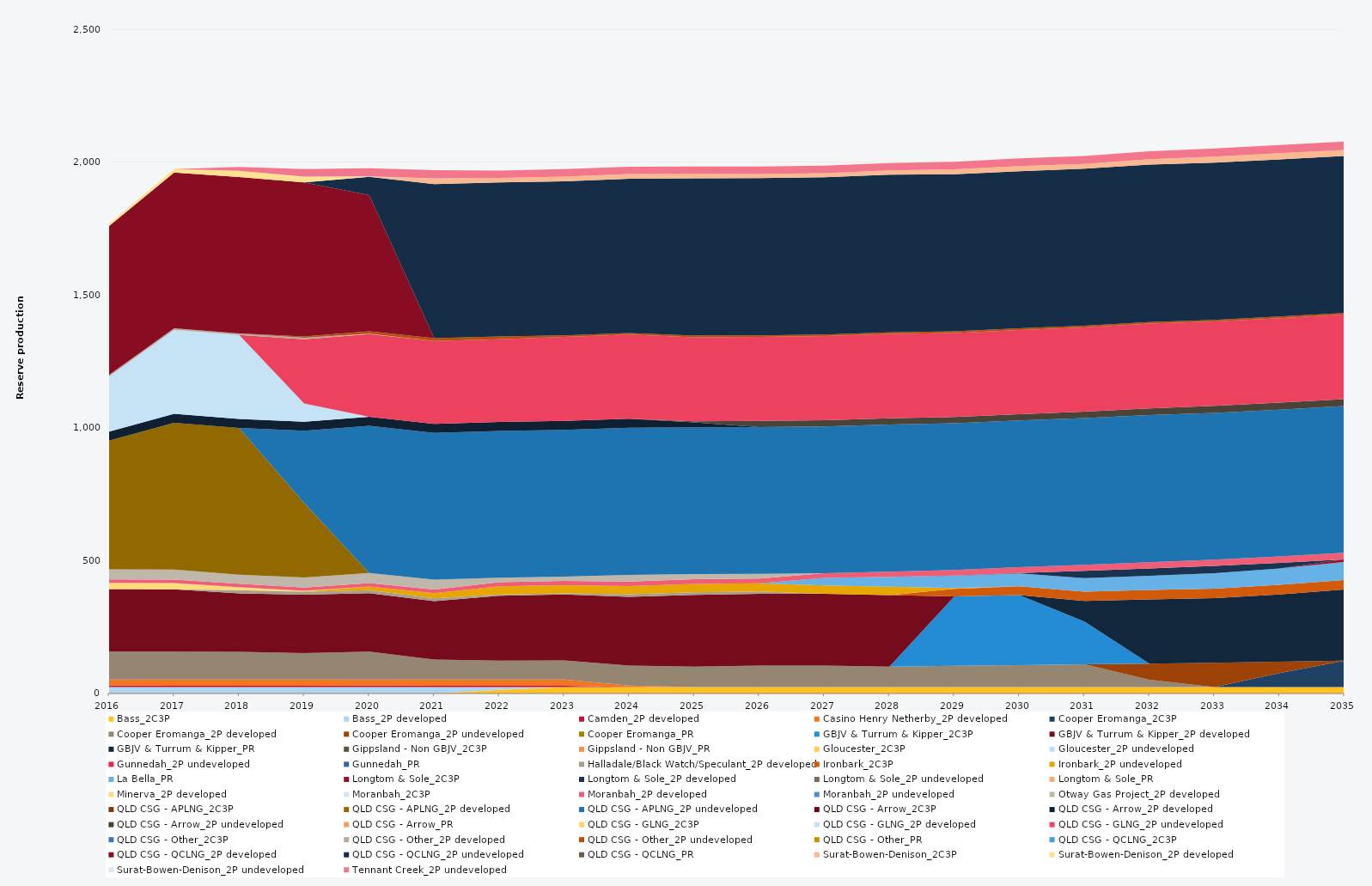
| Category | Bass_2C3P | Bass_2P developed | Camden_2P developed | Casino Henry Netherby_2P developed | Cooper Eromanga_2C3P | Cooper Eromanga_2P developed | Cooper Eromanga_2P undeveloped | Cooper Eromanga_PR | GBJV & Turrum & Kipper_2C3P | GBJV & Turrum & Kipper_2P developed | GBJV & Turrum & Kipper_PR | Gippsland - Non GBJV_2C3P | Gippsland - Non GBJV_PR | Gloucester_2C3P | Gloucester_2P undeveloped | Gunnedah_2P undeveloped | Gunnedah_PR | Halladale/Black Watch/Speculant_2P developed | Ironbark_2C3P | Ironbark_2P undeveloped | La Bella_PR | Longtom & Sole_2C3P | Longtom & Sole_2P developed | Longtom & Sole_2P undeveloped | Longtom & Sole_PR | Minerva_2P developed | Moranbah_2C3P | Moranbah_2P developed | Moranbah_2P undeveloped | Otway Gas Project_2P developed | QLD CSG - APLNG_2C3P | QLD CSG - APLNG_2P developed | QLD CSG - APLNG_2P undeveloped | QLD CSG - Arrow_2C3P | QLD CSG - Arrow_2P developed | QLD CSG - Arrow_2P undeveloped | QLD CSG - Arrow_PR | QLD CSG - GLNG_2C3P | QLD CSG - GLNG_2P developed | QLD CSG - GLNG_2P undeveloped | QLD CSG - Other_2C3P | QLD CSG - Other_2P developed | QLD CSG - Other_2P undeveloped | QLD CSG - Other_PR | QLD CSG - QCLNG_2C3P | QLD CSG - QCLNG_2P developed | QLD CSG - QCLNG_2P undeveloped | QLD CSG - QCLNG_PR | Surat-Bowen-Denison_2C3P | Surat-Bowen-Denison_2P developed | Surat-Bowen-Denison_2P undeveloped | Tennant Creek_2P undeveloped |
|---|---|---|---|---|---|---|---|---|---|---|---|---|---|---|---|---|---|---|---|---|---|---|---|---|---|---|---|---|---|---|---|---|---|---|---|---|---|---|---|---|---|---|---|---|---|---|---|---|---|---|---|---|
| 2016 | 0 | 24.522 | 5 | 23.12 | 0 | 105 | 0 | 0 | 0 | 235.041 | 0 | 0 | 0 | 0 | 0 | 0 | 0 | 0 | 0 | 0 | 0 | 0 | 0 | 0 | 0 | 23.79 | 0 | 12.867 | 0 | 38 | 0 | 484.599 | 0 | 0 | 34.038 | 0 | 0 | 0 | 207.333 | 0 | 0 | 5.856 | 0 | 0 | 0 | 559.871 | 0 | 0 | 0 | 9.633 | 0 | 0 |
| 2017 | 0 | 24.455 | 5 | 23.12 | 0 | 105 | 0 | 0 | 0 | 234.501 | 0 | 0 | 0 | 0 | 0 | 0 | 0 | 0 | 0 | 0 | 0 | 0 | 0 | 0 | 0 | 23.725 | 0 | 12.873 | 0 | 38 | 0 | 552.245 | 0 | 0 | 33.945 | 0 | 0 | 0 | 315.713 | 0 | 0 | 5.84 | 0 | 0 | 0 | 586.525 | 0 | 0 | 0 | 12.734 | 0 | 0 |
| 2018 | 0 | 24.455 | 5 | 23.12 | 0 | 104.043 | 0 | 0 | 0 | 220 | 0 | 0 | 0 | 0 | 0 | 0 | 0 | 12.649 | 0 | 0 | 0 | 0 | 0 | 0 | 0 | 11.034 | 0 | 13.04 | 0 | 34.022 | 0 | 552.245 | 0 | 0 | 33.945 | 0 | 0 | 0 | 315.648 | 0 | 0 | 5.84 | 0 | 0 | 0 | 588.841 | 0 | 0 | 0 | 23.155 | 0 | 14.55 |
| 2019 | 0 | 24.455 | 5 | 23.12 | 0 | 99.202 | 0 | 0 | 0 | 220 | 0 | 0 | 0 | 0 | 0 | 0 | 0 | 10.95 | 0 | 1.292 | 0 | 0 | 0 | 0 | 0 | 2.129 | 0 | 12.81 | 0 | 38 | 0 | 280.461 | 271.784 | 0 | 33.945 | 0 | 0 | 0 | 68.606 | 241.519 | 0 | 5.84 | 4.563 | 0 | 0 | 579.675 | 0 | 0 | 0 | 21.293 | 0.604 | 28.083 |
| 2020 | 0 | 24.522 | 5 | 23.12 | 0 | 105 | 0 | 0 | 0 | 220 | 0 | 0 | 0 | 0 | 0 | 0 | 0 | 10.95 | 0 | 14.318 | 0 | 0 | 0 | 0 | 0 | 0.073 | 0 | 12.781 | 0 | 38 | 0 | 0 | 553.758 | 0 | 34.038 | 0 | 0 | 0 | 0 | 310.988 | 0 | 1.624 | 8.795 | 0 | 0 | 512.487 | 68.916 | 0 | 0 | 0 | 1.396 | 30.893 |
| 2021 | 0 | 24.455 | 5 | 23.12 | 0 | 75.448 | 0 | 0 | 0 | 220 | 0 | 0 | 0 | 0 | 0 | 0 | 0 | 9.8 | 0 | 19.943 | 0 | 0 | 0 | 0 | 0 | 0 | 0 | 13.533 | 0 | 37.332 | 0 | 0 | 552.245 | 0 | 33.945 | 0 | 0 | 0 | 0 | 311.959 | 0 | 0 | 10.403 | 0 | 0 | 0 | 580.101 | 0 | 21.745 | 0 | 0 | 30.387 |
| 2022 | 13.672 | 10.783 | 5 | 23.12 | 0 | 70.92 | 0 | 0 | 0 | 244.118 | 0 | 0 | 0 | 0 | 0 | 0 | 0 | 5.381 | 0 | 30.17 | 0 | 0 | 0 | 0 | 0 | 0 | 0 | 15.298 | 0 | 17.094 | 0 | 0 | 552.245 | 0 | 33.945 | 0 | 0 | 0 | 0 | 311.898 | 0 | 0 | 10.403 | 0 | 0 | 0 | 579.606 | 0 | 16.741 | 0 | 0 | 27.517 |
| 2023 | 24.455 | 0 | 5 | 23.12 | 0 | 71.721 | 0 | 0 | 0 | 248.04 | 0 | 0 | 0 | 0 | 0 | 0 | 0 | 4.604 | 0 | 30.17 | 0 | 0 | 0 | 0 | 0 | 0 | 0 | 16.264 | 0 | 16.173 | 0 | 0 | 552.245 | 0 | 33.945 | 0 | 0 | 0 | 0 | 316.625 | 0 | 0 | 5.84 | 0 | 0 | 0 | 579.587 | 0 | 17.916 | 0 | 0 | 27.672 |
| 2024 | 24.522 | 0 | 0 | 5.3 | 0 | 75.393 | 0 | 0 | 0 | 258.954 | 0 | 0 | 0 | 0 | 0 | 0 | 0 | 9.196 | 0 | 31.053 | 0 | 0 | 0 | 0 | 0 | 0 | 0 | 16.79 | 0 | 24.83 | 0 | 0 | 553.758 | 0 | 34.038 | 0 | 0 | 0 | 0 | 317.359 | 0 | 0 | 5.856 | 0 | 0 | 0 | 580.592 | 0 | 17.19 | 0 | 0 | 27.368 |
| 2025 | 24.455 | 0 | 0 | 0 | 0 | 76.645 | 0 | 0 | 0 | 270 | 0 | 0 | 0 | 0 | 0 | 0 | 0 | 10.075 | 0 | 31.394 | 0 | 0 | 0 | 0 | 0 | 0 | 0 | 17.268 | 0 | 19.949 | 0 | 0 | 552.245 | 0 | 18.166 | 3.869 | 0 | 0 | 0 | 316.795 | 0 | 0 | 5.84 | 0 | 0 | 0 | 591.794 | 0 | 17.182 | 0 | 0 | 27.597 |
| 2026 | 24.455 | 0 | 0 | 0 | 0 | 80.807 | 0 | 0 | 0 | 270 | 0 | 0 | 0 | 0 | 0 | 0 | 0 | 8.396 | 0 | 31.196 | 0 | 0 | 0.011 | 0 | 0 | 0 | 0 | 17.518 | 0 | 18.205 | 0 | 0 | 552.245 | 0 | 0 | 22.841 | 0 | 0 | 0 | 316.693 | 0 | 0 | 5.84 | 0 | 0 | 0 | 591.753 | 0 | 15.248 | 0 | 0 | 27.771 |
| 2027 | 24.455 | 0 | 0 | 0 | 0 | 80.73 | 0 | 0 | 0 | 270 | 0 | 0 | 0 | 0 | 0 | 0 | 0 | 0 | 0 | 31.236 | 28.207 | 0 | 0.097 | 0 | 0 | 0 | 0 | 18.14 | 0 | 0 | 0 | 0 | 552.245 | 0 | 0 | 23.131 | 0 | 0 | 0 | 316.854 | 0 | 0 | 5.84 | 0 | 0 | 0 | 591.693 | 0 | 15.651 | 0 | 0 | 28.005 |
| 2028 | 24.522 | 0 | 0 | 0 | 0 | 76.947 | 0 | 0 | 0 | 268.454 | 0 | 0 | 0 | 0 | 0 | 0 | 0 | 0 | 0 | 31.572 | 37.832 | 0 | 0.101 | 0 | 0 | 0 | 0 | 18.99 | 0 | 0 | 0 | 0 | 553.758 | 0 | 0 | 23.47 | 0 | 0 | 0 | 317.828 | 0 | 0 | 5.856 | 0 | 0 | 0 | 593.234 | 0 | 15.835 | 0 | 0 | 28.198 |
| 2029 | 24.455 | 0 | 0 | 0 | 0 | 79.712 | 0 | 0 | 261.023 | 0 | 0 | 0 | 0 | 0 | 0 | 0 | 0 | 0 | 28.223 | 3.655 | 45.696 | 0 | 1.505 | 0 | 0 | 0 | 0 | 20.344 | 0 | 0 | 0 | 0 | 552.245 | 0 | 0 | 23.353 | 0 | 0 | 0 | 316.897 | 0 | 0 | 5.84 | 0 | 0 | 0 | 591.622 | 0 | 18.022 | 0 | 0 | 28.646 |
| 2030 | 24.455 | 0 | 0 | 0 | 0 | 82.416 | 0 | 0 | 263.403 | 0 | 0 | 0 | 0 | 0 | 0 | 0 | 0 | 0 | 33.128 | 0 | 48.707 | 0 | 1.566 | 0 | 0 | 0 | 0 | 21.608 | 0 | 0 | 0 | 0 | 552.245 | 0 | 0 | 23.602 | 0 | 0 | 0 | 317.279 | 0 | 0 | 5.84 | 0 | 0 | 0 | 591.579 | 0 | 18.895 | 0 | 0 | 29.018 |
| 2031 | 24.455 | 0 | 0 | 0 | 0 | 85.13 | 0 | 0 | 161.289 | 0 | 77.845 | 0 | 0 | 0 | 0 | 0 | 0 | 0 | 34.264 | 0 | 51.184 | 0 | 27.375 | 0 | 0 | 0 | 0 | 22.555 | 0 | 0 | 0 | 0 | 552.245 | 0 | 0 | 24.176 | 0 | 0 | 0 | 317.559 | 0 | 0 | 5.84 | 0 | 0 | 0 | 591.53 | 0 | 17.852 | 0 | 0 | 29.387 |
| 2032 | 24.522 | 0 | 0 | 0 | 0 | 26.883 | 61.029 | 0 | 0 | 0 | 241.848 | 0 | 0 | 0 | 0 | 0 | 0 | 0 | 35.162 | 0 | 53.89 | 0 | 27.45 | 0 | 0 | 0 | 0 | 23.473 | 0 | 0 | 0 | 0 | 553.758 | 0 | 0 | 25.27 | 0 | 0 | 0 | 318.687 | 0 | 0 | 5.856 | 0 | 0 | 0 | 593.07 | 0 | 19.818 | 0 | 0 | 30.262 |
| 2033 | 24.455 | 0 | 0 | 0 | 0 | 0 | 90.829 | 0 | 0 | 0 | 243.313 | 0 | 0 | 0 | 0 | 0 | 0 | 0 | 35.7 | 0 | 58.2 | 0 | 27.375 | 0 | 0 | 0 | 0 | 23.984 | 0 | 0 | 0 | 0 | 552.245 | 0 | 0 | 26.292 | 0 | 0 | 0 | 318.155 | 0 | 0 | 5.84 | 0 | 0 | 0 | 591.435 | 0 | 22.368 | 0 | 0 | 30.759 |
| 2034 | 24.455 | 0 | 0 | 0 | 52.76 | 0 | 42.724 | 0 | 0 | 0 | 252.994 | 0 | 0 | 0 | 0 | 0 | 0 | 0 | 35.888 | 0 | 61.378 | 0.075 | 21.001 | 0 | 0 | 0 | 0 | 24.559 | 0 | 0 | 0 | 0 | 552.245 | 0 | 0 | 26.478 | 0 | 0 | 0 | 318.338 | 0 | 0 | 5.84 | 0 | 0 | 0 | 591.394 | 0 | 23.173 | 0 | 0 | 31.073 |
| 2035 | 24.455 | 0 | 0 | 0 | 99.428 | 0 | 0 | 0 | 0 | 0 | 267.672 | 0 | 0 | 0 | 0 | 0 | 0 | 0 | 36.003 | 0 | 67.285 | 9.974 | 0 | 0 | 0 | 0 | 0 | 24.812 | 0 | 0 | 0 | 0 | 552.245 | 0 | 0 | 26.393 | 0 | 0 | 0 | 317.822 | 0 | 0 | 5.84 | 0 | 0 | 0 | 591.053 | 0 | 23.064 | 0 | 0 | 31.489 |